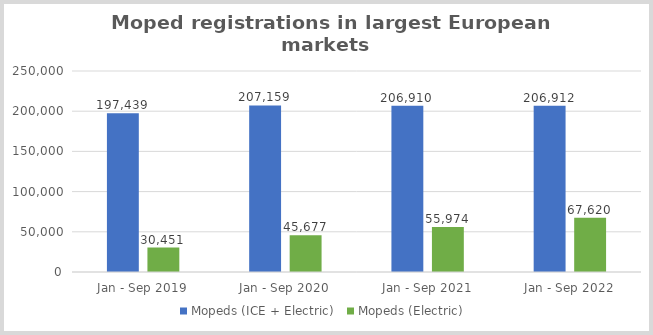
| Category | Mopeds (ICE + Electric)  | Mopeds (Electric)  |
|---|---|---|
| Jan - Sep 2019 | 197439 | 30451 |
| Jan - Sep 2020 | 207159 | 45677 |
| Jan - Sep 2021 | 206910 | 55974 |
| Jan - Sep 2022 | 206912 | 67620 |